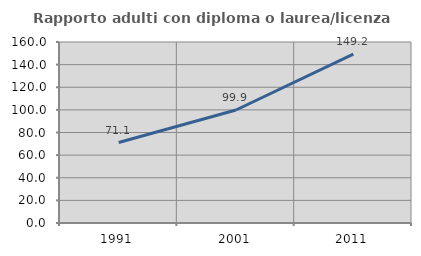
| Category | Rapporto adulti con diploma o laurea/licenza media  |
|---|---|
| 1991.0 | 71.128 |
| 2001.0 | 99.9 |
| 2011.0 | 149.227 |